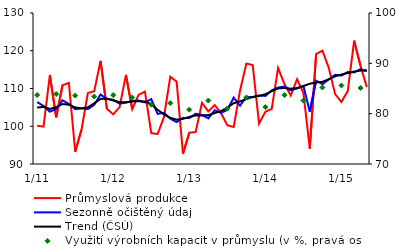
| Category | Průmyslová produkce | Sezonně očištěný údaj | Trend (ČSÚ) |
|---|---|---|---|
|  1/11 | 100.125 | 106.414 | 104.943 |
| 2 | 99.895 | 105.369 | 105.127 |
| 3 | 113.575 | 103.858 | 104.583 |
| 4 | 102.361 | 104.568 | 105.033 |
| 5 | 110.85 | 106.885 | 105.881 |
| 6 | 111.479 | 105.89 | 105.706 |
| 7 | 93.266 | 104.525 | 104.998 |
| 8 | 99.142 | 104.746 | 104.736 |
| 9 | 108.768 | 104.547 | 105.015 |
| 10 | 109.279 | 105.68 | 106.083 |
| 11 | 117.326 | 108.4 | 107.241 |
| 12 | 104.632 | 107.213 | 107.354 |
|  1/12 | 103.144 | 107.022 | 106.825 |
| 2 | 105.056 | 105.978 | 106.383 |
| 3 | 113.607 | 106.274 | 106.343 |
| 4 | 104.516 | 106.654 | 106.573 |
| 5 | 108.344 | 106.82 | 106.628 |
| 6 | 109.159 | 106.303 | 106.546 |
| 7 | 98.175 | 107.183 | 105.839 |
| 8 | 97.949 | 103.271 | 104.356 |
| 9 | 102.408 | 103.571 | 103.149 |
| 10 | 113.13 | 102.001 | 102.235 |
| 11 | 111.812 | 101.107 | 101.733 |
| 12 | 92.727 | 102.22 | 101.974 |
|  1/13 | 98.292 | 102.192 | 102.463 |
| 2 | 98.456 | 103.31 | 102.877 |
| 3 | 106.198 | 102.998 | 102.861 |
| 4 | 103.916 | 102.086 | 102.933 |
| 5 | 105.608 | 104.239 | 103.508 |
| 6 | 103.485 | 103.548 | 103.997 |
| 7 | 100.252 | 104.337 | 104.965 |
| 8 | 99.809 | 107.573 | 106.11 |
| 9 | 109.445 | 105.454 | 106.586 |
| 10 | 116.609 | 107.804 | 107.184 |
| 11 | 116.209 | 107.698 | 107.78 |
| 12 | 100.695 | 108.149 | 108.039 |
|  1/14 | 103.844 | 108.028 | 108.487 |
| 2 | 104.612 | 109.498 | 109.301 |
| 3 | 115.418 | 110.251 | 110.024 |
| 4 | 111.21 | 110.507 | 110.144 |
| 5 | 108.149 | 109.52 | 109.952 |
| 6 | 112.468 | 110.015 | 110.114 |
| 7 | 108.791 | 110.647 | 110.656 |
| 8 | 94.08 | 103.878 | 111.268 |
| 9 | 119.128 | 112.076 | 111.613 |
| 10 | 120.041 | 111.15 | 111.781 |
| 11 | 115.471 | 112.419 | 112.427 |
| 12 | 108.508 | 113.629 | 113.223 |
|  1/15 | 106.402 | 113.432 | 113.703 |
| 2 | 109.386 | 114.365 | 114.106 |
| 3 | 122.651 | 114.27 | 114.487 |
| 4 | 116.011 | 115.125 | 114.745 |
| 5 | 110.36 | 114.574 | 114.824 |